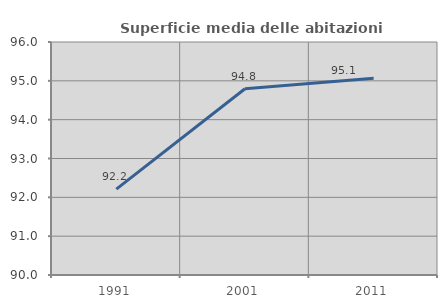
| Category | Superficie media delle abitazioni occupate |
|---|---|
| 1991.0 | 92.213 |
| 2001.0 | 94.795 |
| 2011.0 | 95.066 |